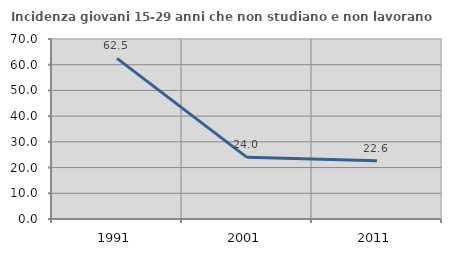
| Category | Incidenza giovani 15-29 anni che non studiano e non lavorano  |
|---|---|
| 1991.0 | 62.455 |
| 2001.0 | 23.973 |
| 2011.0 | 22.65 |